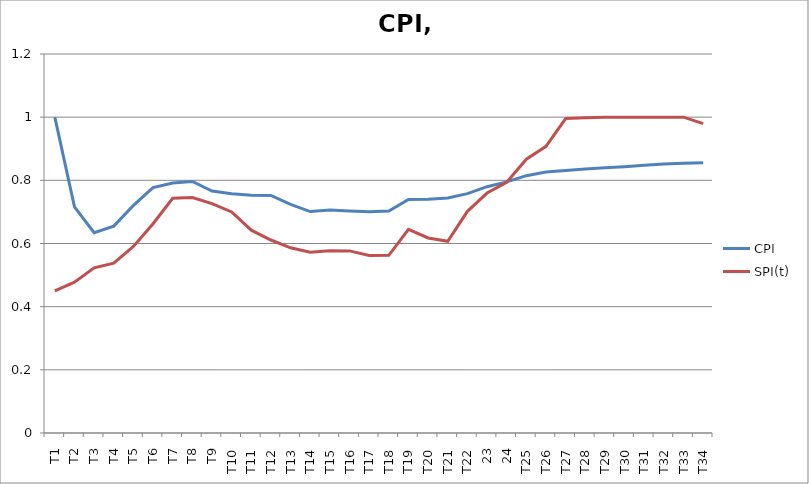
| Category | CPI | SPI(t) |
|---|---|---|
| T1 | 1 | 0.45 |
| T2 | 0.716 | 0.478 |
| T3 | 0.634 | 0.523 |
| T4 | 0.655 | 0.538 |
| T5 | 0.721 | 0.591 |
| T6 | 0.777 | 0.662 |
| T7 | 0.791 | 0.743 |
| T8 | 0.797 | 0.746 |
| T9 | 0.766 | 0.726 |
| T10 | 0.758 | 0.7 |
| T11 | 0.753 | 0.642 |
| T12 | 0.752 | 0.611 |
| T13 | 0.724 | 0.586 |
| T14 | 0.701 | 0.573 |
| T15 | 0.706 | 0.577 |
| T16 | 0.703 | 0.577 |
| T17 | 0.701 | 0.562 |
| T18 | 0.703 | 0.562 |
| T19 | 0.739 | 0.645 |
| T20 | 0.74 | 0.618 |
| T21 | 0.744 | 0.607 |
| T22 | 0.758 | 0.702 |
| 23 | 0.78 | 0.76 |
| 24 | 0.795 | 0.794 |
| T25 | 0.815 | 0.867 |
| T26 | 0.826 | 0.908 |
| T27 | 0.831 | 0.996 |
| T28 | 0.836 | 0.998 |
| T29 | 0.839 | 1 |
| T30 | 0.843 | 1 |
| T31 | 0.847 | 1 |
| T32 | 0.851 | 1 |
| T33 | 0.854 | 1 |
| T34 | 0.855 | 0.98 |